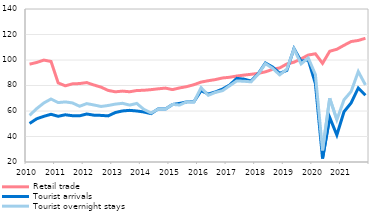
| Category | Retail trade  | Tourist arrivals  | Tourist overnight stays  |
|---|---|---|---|
| 2010 | 96.734 | 50.215 | 56.603 |
| II | 98.065 | 53.898 | 61.879 |
| III | 99.934 | 55.845 | 66.326 |
| IV | 98.846 | 57.416 | 69.405 |
| 2011 | 82.028 | 55.866 | 66.609 |
| II | 79.758 | 57.031 | 67.123 |
| III | 81.281 | 56.305 | 66.337 |
| IV | 81.531 | 56.225 | 63.729 |
| 2012 | 82.296 | 57.643 | 65.802 |
| II | 80.401 | 56.728 | 64.735 |
| III | 78.715 | 56.555 | 63.558 |
| IV | 76.144 | 56.175 | 64.326 |
| 2013 | 75.044 | 58.796 | 65.395 |
| II | 75.605 | 60.041 | 66.026 |
| III | 75.082 | 60.502 | 64.648 |
| IV | 76.062 | 60.007 | 65.933 |
| 2014 | 76.259 | 59.226 | 61.245 |
| II | 76.754 | 57.938 | 58.458 |
| III | 77.397 | 61.606 | 61.447 |
| IV | 77.96 | 61.479 | 61.411 |
| 2015 | 76.778 | 65.109 | 65.16 |
| II | 78.105 | 65.955 | 64.707 |
| III | 79.132 | 67.164 | 67.263 |
| IV | 80.646 | 67.265 | 67.021 |
| 2016 | 82.672 | 75.964 | 78.324 |
| II | 83.751 | 73.305 | 72.31 |
| III | 84.639 | 74.966 | 74.594 |
| IV | 85.908 | 77.205 | 75.944 |
| 2017 | 86.455 | 80.362 | 79.82 |
| II | 87.428 | 85.601 | 83.58 |
| III | 88.168 | 84.988 | 83.345 |
| IV | 88.781 | 83.506 | 82.875 |
| 2018 | 89.522 | 89.265 | 88.892 |
| II | 90.715 | 97.663 | 97.177 |
| III | 92.636 | 94.535 | 93.478 |
| IV | 93.777 | 89.539 | 88.359 |
| 2019 | 96.899 | 91.851 | 92.751 |
| II | 98.268 | 108.963 | 108.71 |
| III | 100.928 | 98.995 | 96.942 |
| IV | 103.906 | 100.192 | 101.598 |
| 2020 | 104.865 | 81.495 | 88.525 |
| II | 97.353 | 22.687 | 29.102 |
| III | 106.852 | 54.941 | 69.973 |
| IV | 108.415 | 41.149 | 53.127 |
| 2021 | 111.53 | 59.447 | 68.747 |
| II | 114.475 | 66.289 | 75.318 |
| III | 115.333 | 78.067 | 90.914 |
| IV | 117.033 | 72.316 | 80.466 |